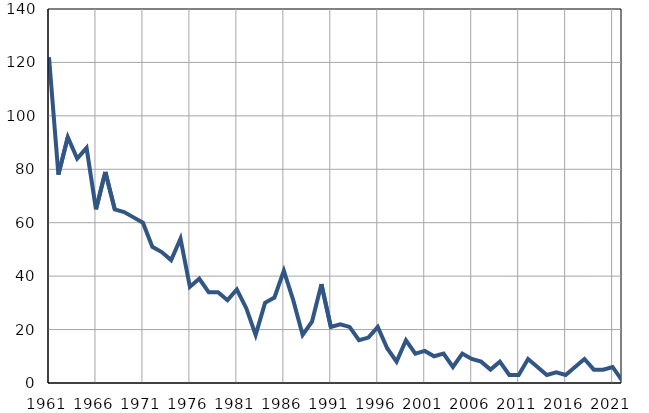
| Category | Умрла 
одојчад |
|---|---|
| 1961.0 | 122 |
| 1962.0 | 78 |
| 1963.0 | 92 |
| 1964.0 | 84 |
| 1965.0 | 88 |
| 1966.0 | 65 |
| 1967.0 | 79 |
| 1968.0 | 65 |
| 1969.0 | 64 |
| 1970.0 | 62 |
| 1971.0 | 60 |
| 1972.0 | 51 |
| 1973.0 | 49 |
| 1974.0 | 46 |
| 1975.0 | 54 |
| 1976.0 | 36 |
| 1977.0 | 39 |
| 1978.0 | 34 |
| 1979.0 | 34 |
| 1980.0 | 31 |
| 1981.0 | 35 |
| 1982.0 | 28 |
| 1983.0 | 18 |
| 1984.0 | 30 |
| 1985.0 | 32 |
| 1986.0 | 42 |
| 1987.0 | 31 |
| 1988.0 | 18 |
| 1989.0 | 23 |
| 1990.0 | 37 |
| 1991.0 | 21 |
| 1992.0 | 22 |
| 1993.0 | 21 |
| 1994.0 | 16 |
| 1995.0 | 17 |
| 1996.0 | 21 |
| 1997.0 | 13 |
| 1998.0 | 8 |
| 1999.0 | 16 |
| 2000.0 | 11 |
| 2001.0 | 12 |
| 2002.0 | 10 |
| 2003.0 | 11 |
| 2004.0 | 6 |
| 2005.0 | 11 |
| 2006.0 | 9 |
| 2007.0 | 8 |
| 2008.0 | 5 |
| 2009.0 | 8 |
| 2010.0 | 3 |
| 2011.0 | 3 |
| 2012.0 | 9 |
| 2013.0 | 6 |
| 2014.0 | 3 |
| 2015.0 | 4 |
| 2016.0 | 3 |
| 2017.0 | 6 |
| 2018.0 | 9 |
| 2019.0 | 5 |
| 2020.0 | 5 |
| 2021.0 | 6 |
| 2022.0 | 1 |